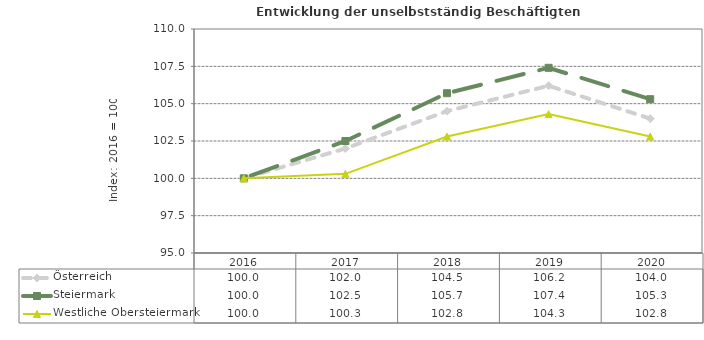
| Category | Österreich | Steiermark | Westliche Obersteiermark |
|---|---|---|---|
| 2020.0 | 104 | 105.3 | 102.8 |
| 2019.0 | 106.2 | 107.4 | 104.3 |
| 2018.0 | 104.5 | 105.7 | 102.8 |
| 2017.0 | 102 | 102.5 | 100.3 |
| 2016.0 | 100 | 100 | 100 |